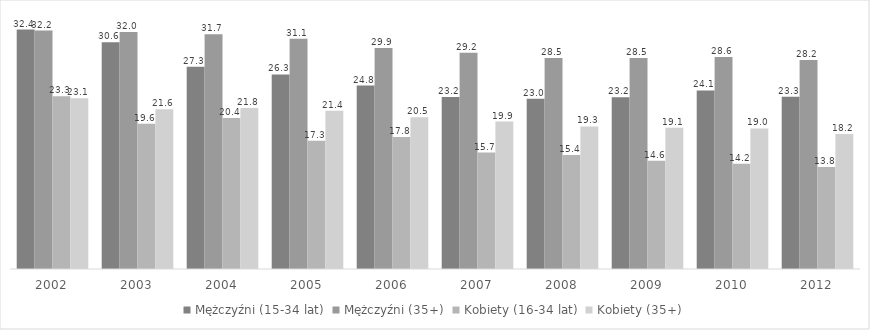
| Category | Mężczyźni (15-34 lat) | Mężczyźni (35+) | Kobiety (16-34 lat) | Kobiety (35+) |
|---|---|---|---|---|
| 2002.0 | 32.35 | 32.22 | 23.34 | 23.09 |
| 2003.0 | 30.64 | 32.02 | 19.62 | 21.6 |
| 2004.0 | 27.34 | 31.73 | 20.42 | 21.75 |
| 2005.0 | 26.3 | 31.1 | 17.32 | 21.37 |
| 2006.0 | 24.79 | 29.86 | 17.83 | 20.49 |
| 2007.0 | 23.23 | 29.23 | 15.74 | 19.93 |
| 2008.0 | 22.99 | 28.52 | 15.4 | 19.27 |
| 2009.0 | 23.22 | 28.51 | 14.63 | 19.1 |
| 2010.0 | 24.13 | 28.64 | 14.23 | 18.99 |
| 2012.0 | 23.27 | 28.23 | 13.8 | 18.24 |